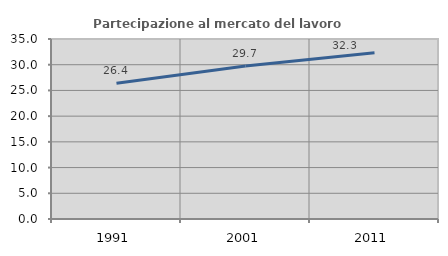
| Category | Partecipazione al mercato del lavoro  femminile |
|---|---|
| 1991.0 | 26.411 |
| 2001.0 | 29.732 |
| 2011.0 | 32.334 |